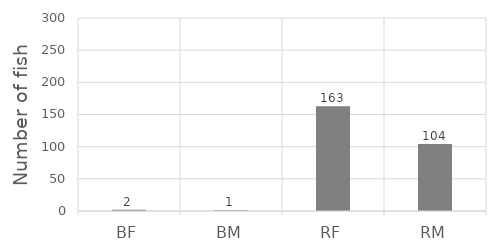
| Category | Series 0 |
|---|---|
| BF | 2 |
| BM | 1 |
| RF | 163 |
| RM | 104 |